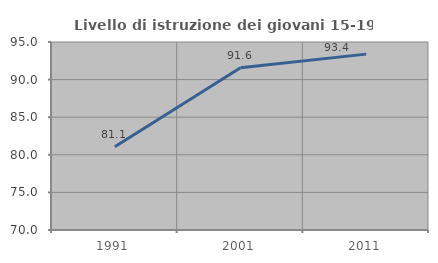
| Category | Livello di istruzione dei giovani 15-19 anni |
|---|---|
| 1991.0 | 81.077 |
| 2001.0 | 91.582 |
| 2011.0 | 93.388 |